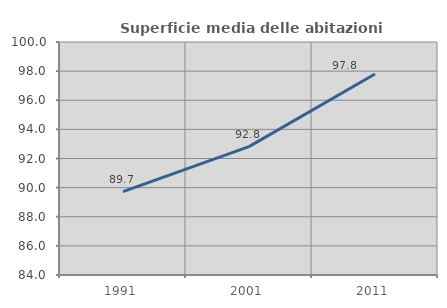
| Category | Superficie media delle abitazioni occupate |
|---|---|
| 1991.0 | 89.729 |
| 2001.0 | 92.818 |
| 2011.0 | 97.804 |